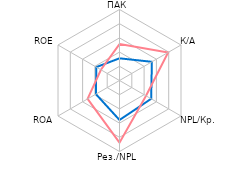
| Category | Србија | Регион |
|---|---|---|
| ПАК | 1.562 | 2.565 |
| К/А | 2.632 | 3.953 |
| NPL/Кр. | 2.576 | 2.158 |
| Рез./NPL | 2.78 | 4.375 |
| ROA | 1.92 | 2.594 |
| ROE | 1.886 | 1.51 |